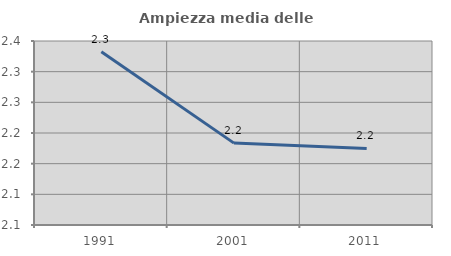
| Category | Ampiezza media delle famiglie |
|---|---|
| 1991.0 | 2.332 |
| 2001.0 | 2.184 |
| 2011.0 | 2.175 |